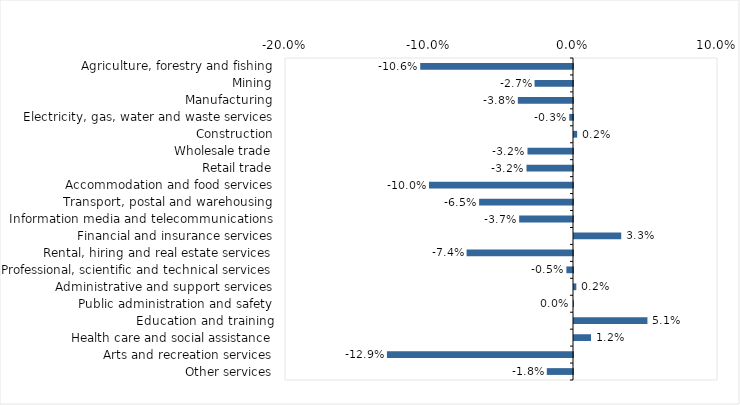
| Category | This week |
|---|---|
| Agriculture, forestry and fishing | -0.106 |
| Mining | -0.027 |
| Manufacturing | -0.038 |
| Electricity, gas, water and waste services | -0.003 |
| Construction | 0.002 |
| Wholesale trade | -0.032 |
| Retail trade | -0.032 |
| Accommodation and food services | -0.1 |
| Transport, postal and warehousing | -0.065 |
| Information media and telecommunications | -0.037 |
| Financial and insurance services | 0.033 |
| Rental, hiring and real estate services | -0.074 |
| Professional, scientific and technical services | -0.005 |
| Administrative and support services | 0.002 |
| Public administration and safety | 0 |
| Education and training | 0.051 |
| Health care and social assistance | 0.012 |
| Arts and recreation services | -0.129 |
| Other services | -0.018 |